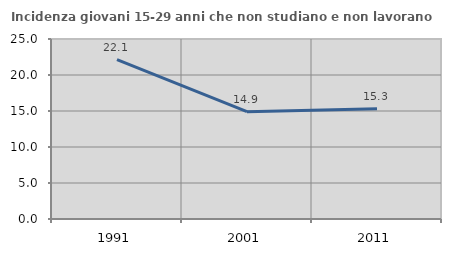
| Category | Incidenza giovani 15-29 anni che non studiano e non lavorano  |
|---|---|
| 1991.0 | 22.148 |
| 2001.0 | 14.902 |
| 2011.0 | 15.306 |